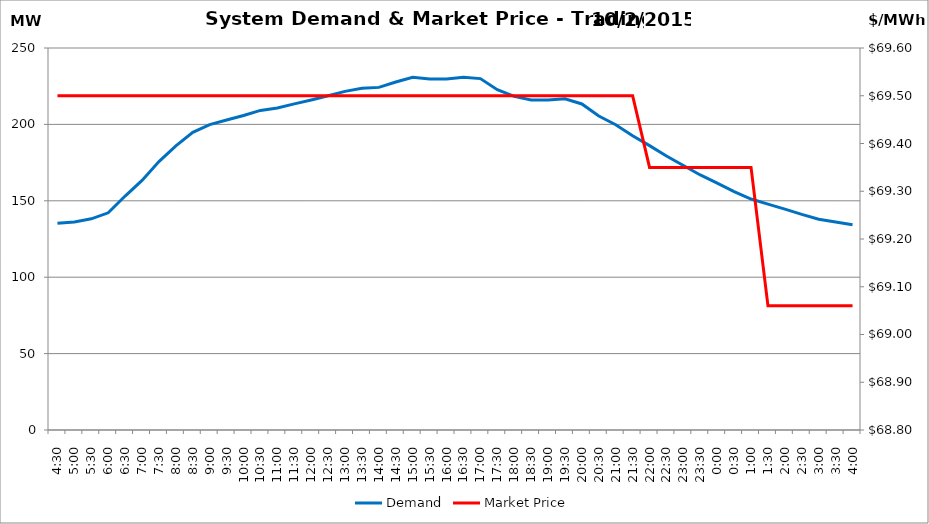
| Category | Demand |
|---|---|
| 0.1875 | 135.33 |
| 0.20833333333333334 | 136.14 |
| 0.22916666666666666 | 138.19 |
| 0.25 | 142.14 |
| 0.270833333333333 | 153.11 |
| 0.291666666666667 | 163.31 |
| 0.3125 | 175.68 |
| 0.333333333333333 | 185.91 |
| 0.354166666666667 | 194.78 |
| 0.375 | 199.89 |
| 0.395833333333333 | 202.87 |
| 0.416666666666667 | 205.82 |
| 0.4375 | 209.15 |
| 0.458333333333333 | 210.76 |
| 0.479166666666667 | 213.41 |
| 0.5 | 216.02 |
| 0.520833333333333 | 218.73 |
| 0.541666666666667 | 221.63 |
| 0.5625 | 223.7 |
| 0.583333333333333 | 224.23 |
| 0.604166666666667 | 227.74 |
| 0.625 | 230.8 |
| 0.645833333333334 | 229.72 |
| 0.666666666666667 | 229.73 |
| 0.6875 | 230.87 |
| 0.708333333333334 | 229.97 |
| 0.729166666666667 | 222.74 |
| 0.75 | 218.35 |
| 0.770833333333334 | 216 |
| 0.791666666666667 | 215.97 |
| 0.8125 | 216.8 |
| 0.833333333333334 | 213.37 |
| 0.854166666666667 | 205.52 |
| 0.875 | 199.8 |
| 0.895833333333334 | 192.57 |
| 0.916666666666667 | 186.11 |
| 0.9375 | 179.28 |
| 0.958333333333334 | 173.07 |
| 0.979166666666667 | 166.92 |
| 1900-01-01 | 161.6 |
| 1900-01-01 00:30:00 | 156.06 |
| 1900-01-01 01:00:00 | 151.17 |
| 1900-01-01 01:30:00 | 147.82 |
| 1900-01-01 02:00:00 | 144.59 |
| 1900-01-01 02:30:00 | 141.12 |
| 1900-01-01 03:00:00 | 137.94 |
| 1900-01-01 03:30:00 | 136.16 |
| 1900-01-01 04:00:00 | 134.38 |